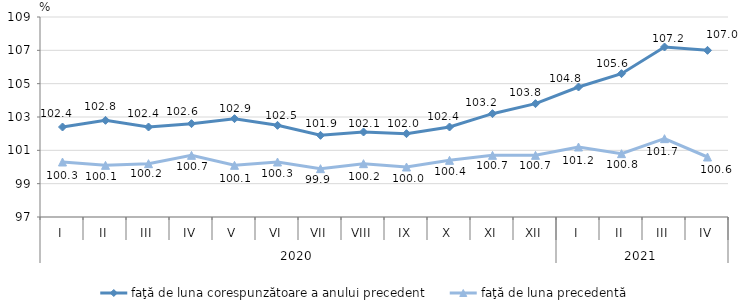
| Category | faţă de luna corespunzătoare a anului precedent | faţă de luna precedentă   |
|---|---|---|
| 0 | 102.4 | 100.3 |
| 1 | 102.8 | 100.1 |
| 2 | 102.4 | 100.2 |
| 3 | 102.6 | 100.7 |
| 4 | 102.9 | 100.1 |
| 5 | 102.5 | 100.3 |
| 6 | 101.9 | 99.9 |
| 7 | 102.1 | 100.2 |
| 8 | 102 | 100 |
| 9 | 102.4 | 100.4 |
| 10 | 103.2 | 100.7 |
| 11 | 103.8 | 100.7 |
| 12 | 104.8 | 101.2 |
| 13 | 105.6 | 100.8 |
| 14 | 107.2 | 101.7 |
| 15 | 107 | 100.6 |